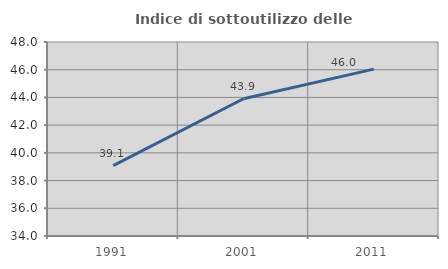
| Category | Indice di sottoutilizzo delle abitazioni  |
|---|---|
| 1991.0 | 39.076 |
| 2001.0 | 43.906 |
| 2011.0 | 46.041 |